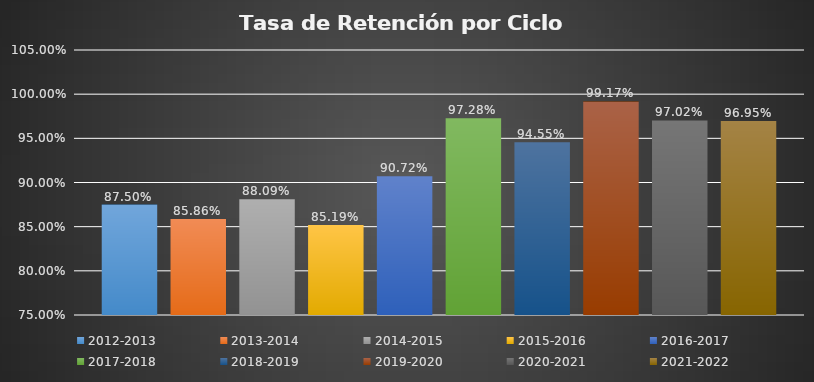
| Category | 2012-2013 | 2013-2014 | 2014-2015 | 2015-2016  | 2016-2017 | 2017-2018 | 2018-2019 | 2019-2020 | 2020-2021 | 2021-2022 |
|---|---|---|---|---|---|---|---|---|---|---|
| 0 | 0.875 | 0.859 | 0.881 | 0.852 | 0.907 | 0.973 | 0.946 | 0.992 | 0.97 | 0.97 |